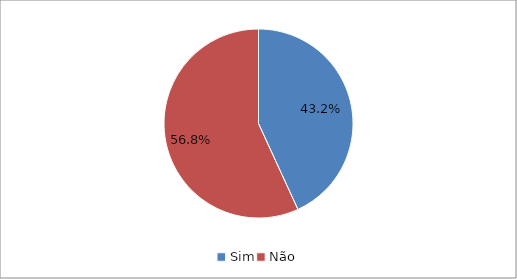
| Category | Series 0 |
|---|---|
| Sim | 0.432 |
| Não | 0.568 |